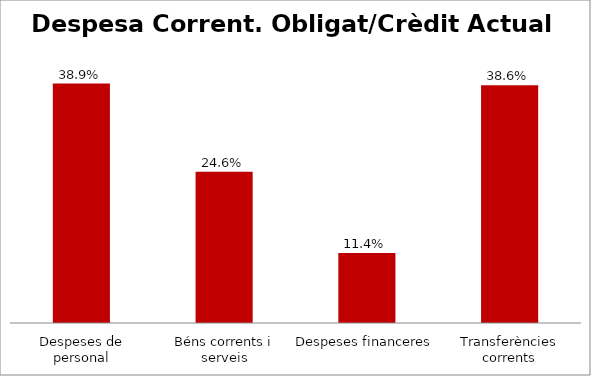
| Category | Series 0 |
|---|---|
| Despeses de personal | 0.389 |
| Béns corrents i serveis | 0.246 |
| Despeses financeres | 0.114 |
| Transferències corrents | 0.386 |